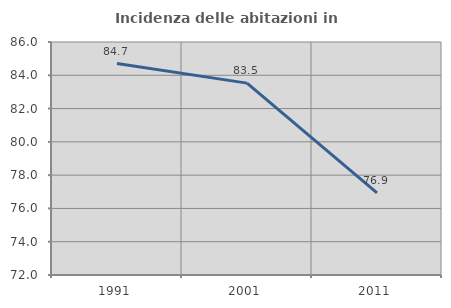
| Category | Incidenza delle abitazioni in proprietà  |
|---|---|
| 1991.0 | 84.706 |
| 2001.0 | 83.528 |
| 2011.0 | 76.937 |